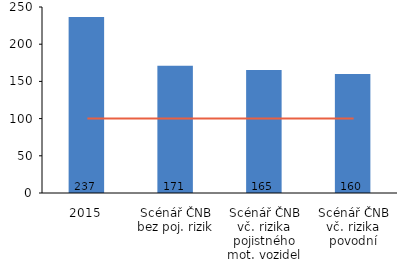
| Category | Series 0 |
|---|---|
| 2015 | 236.61 |
| Scénář ČNB bez poj. rizik | 170.95 |
| Scénář ČNB vč. rizika pojistného mot. vozidel | 165.3 |
| Scénář ČNB vč. rizika povodní | 160.11 |